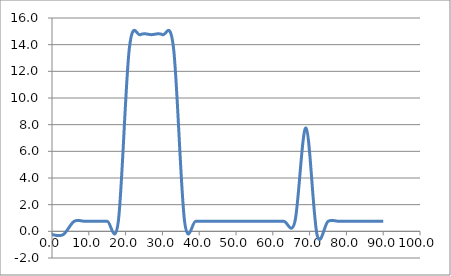
| Category | Elevation (in.) |
|---|---|
| 0.024 | -0.25 |
| 3.024 | -0.25 |
| 6.024 | 0.75 |
| 9.024000000000001 | 0.75 |
| 12.024000000000001 | 0.75 |
| 15.024000000000001 | 0.75 |
| 18.024 | 0.75 |
| 21.024 | 13.75 |
| 24.023999999999997 | 14.75 |
| 27.023999999999997 | 14.75 |
| 30.023999999999997 | 14.75 |
| 33.024 | 13.75 |
| 36.024 | 0.75 |
| 39.024 | 0.75 |
| 42.024 | 0.75 |
| 45.024 | 0.75 |
| 48.024 | 0.75 |
| 51.024 | 0.75 |
| 54.024 | 0.75 |
| 57.024 | 0.75 |
| 60.024 | 0.75 |
| 63.024 | 0.75 |
| 66.024 | 0.75 |
| 69.024 | 7.75 |
| 72.024 | -0.25 |
| 75.024 | 0.75 |
| 78.024 | 0.75 |
| 81.024 | 0.75 |
| 84.024 | 0.75 |
| 87.024 | 0.75 |
| 90.024 | 0.75 |